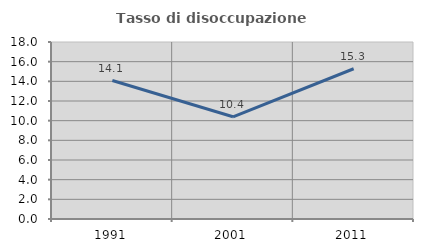
| Category | Tasso di disoccupazione giovanile  |
|---|---|
| 1991.0 | 14.085 |
| 2001.0 | 10.396 |
| 2011.0 | 15.278 |